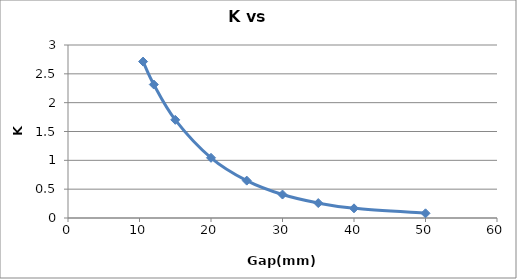
| Category | K |
|---|---|
| 10.5 | 2.713 |
| 12.0 | 2.314 |
| 15.0 | 1.702 |
| 20.0 | 1.044 |
| 25.0 | 0.648 |
| 30.0 | 0.407 |
| 35.0 | 0.259 |
| 40.0 | 0.168 |
| 50.0 | 0.081 |